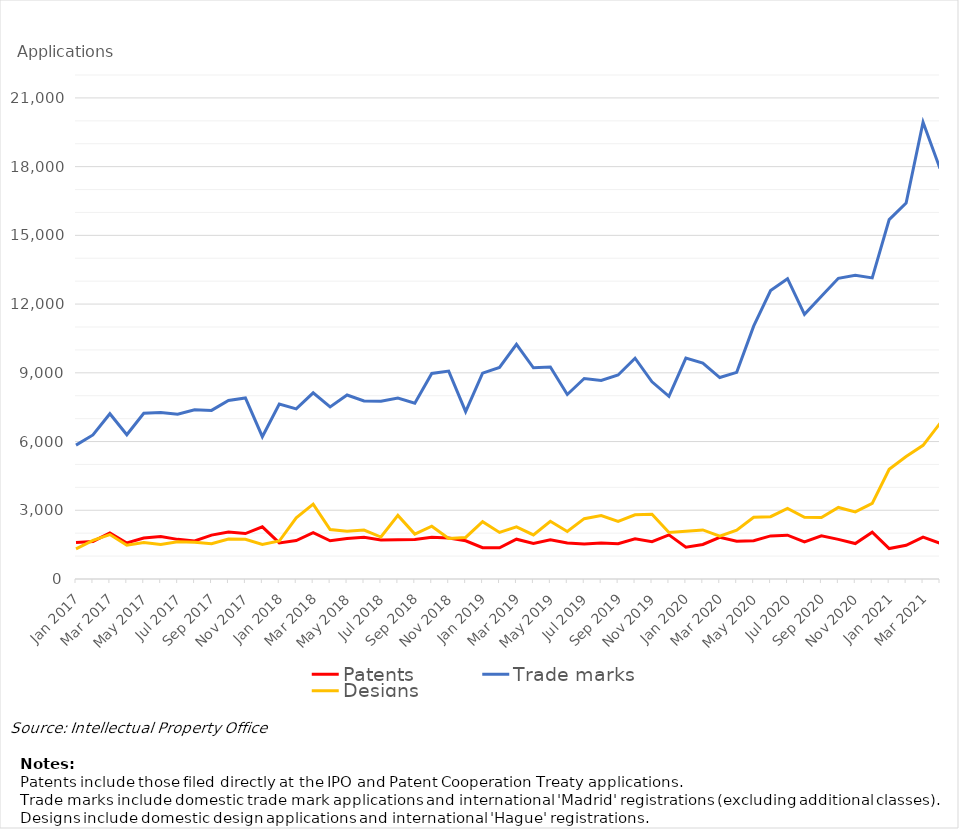
| Category | Patents | Trade marks | Designs |
|---|---|---|---|
| Jan 2017 | 1596 | 5843 | 1318 |
| Feb 2017 | 1640 | 6288 | 1687 |
| Mar 2017 | 2011 | 7214 | 1940 |
| Apr 2017 | 1573 | 6297 | 1474 |
| May 2017 | 1790 | 7234 | 1592 |
| Jun 2017 | 1853 | 7263 | 1502 |
| Jul 2017 | 1730 | 7197 | 1627 |
| Aug 2017 | 1657 | 7389 | 1600 |
| Sep 2017 | 1915 | 7359 | 1544 |
| Oct 2017 | 2055 | 7792 | 1745 |
| Nov 2017 | 1983 | 7901 | 1736 |
| Dec 2017 | 2277 | 6211 | 1507 |
| Jan 2018 | 1575 | 7634 | 1658 |
| Feb 2018 | 1676 | 7428 | 2672 |
| Mar 2018 | 2022 | 8127 | 3267 |
| Apr 2018 | 1670 | 7512 | 2160 |
| May 2018 | 1767 | 8030 | 2083 |
| Jun 2018 | 1821 | 7769 | 2136 |
| Jul 2018 | 1704 | 7757 | 1832 |
| Aug 2018 | 1713 | 7897 | 2777 |
| Sep 2018 | 1725 | 7673 | 1960 |
| Oct 2018 | 1818 | 8972 | 2302 |
| Nov 2018 | 1787 | 9076 | 1765 |
| Dec 2018 | 1670 | 7304 | 1815 |
| Jan 2019 | 1367 | 8984 | 2505 |
| Feb 2019 | 1361 | 9234 | 2031 |
| Mar 2019 | 1737 | 10243 | 2274 |
| Apr 2019 | 1552 | 9219 | 1923 |
| May 2019 | 1710 | 9251 | 2520 |
| Jun 2019 | 1569 | 8053 | 2074 |
| Jul 2019 | 1527 | 8752 | 2634 |
| Aug 2019 | 1571 | 8670 | 2768 |
| Sep 2019 | 1540 | 8907 | 2511 |
| Oct 2019 | 1755 | 9636 | 2800 |
| Nov 2019 | 1630 | 8607 | 2827 |
| Dec 2019 | 1926 | 7970 | 2028 |
| Jan 2020 | 1392 | 9642 | 2082 |
| Feb 2020 | 1506 | 9428 | 2143 |
| Mar 2020 | 1819 | 8794 | 1871 |
| Apr 2020 | 1648 | 9021 | 2127 |
| May 2020 | 1671 | 11035 | 2694 |
| Jun 2020 | 1880 | 12593 | 2721 |
| Jul 2020 | 1911 | 13110 | 3085 |
| Aug 2020 | 1616 | 11551 | 2694 |
| Sep 2020 | 1886 | 12340 | 2686 |
| Oct 2020 | 1731 | 13126 | 3124 |
| Nov 2020 | 1548 | 13254 | 2930 |
| Dec 2020 | 2043 | 13143 | 3303 |
| Jan 2021 | 1330 | 15686 | 4792 |
| Feb 2021 | 1472 | 16412 | 5347 |
| Mar 2021 | 1831 | 19936 | 5836 |
| Apr 2021 | 1565 | 17914 | 6794 |